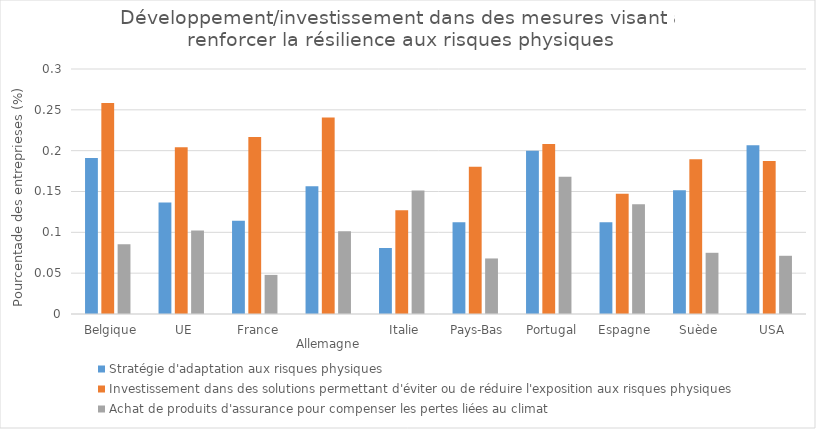
| Category | Stratégie d'adaptation aux risques physiques  | Investissement dans des solutions permettant d'éviter ou de réduire l'exposition aux risques physiques  | Achat de produits d'assurance pour compenser les pertes liées au climat |
|---|---|---|---|
|   Belgique | 0.191 | 0.258 | 0.085 |
|   UE | 0.137 | 0.204 | 0.102 |
|   France | 0.114 | 0.217 | 0.048 |
|   Allemagne | 0.156 | 0.241 | 0.101 |
|   Italie | 0.081 | 0.127 | 0.151 |
|   Pays-Bas | 0.112 | 0.18 | 0.068 |
|   Portugal | 0.2 | 0.208 | 0.168 |
|   Espagne | 0.112 | 0.147 | 0.135 |
|   Suède | 0.151 | 0.19 | 0.075 |
|   USA | 0.207 | 0.187 | 0.071 |